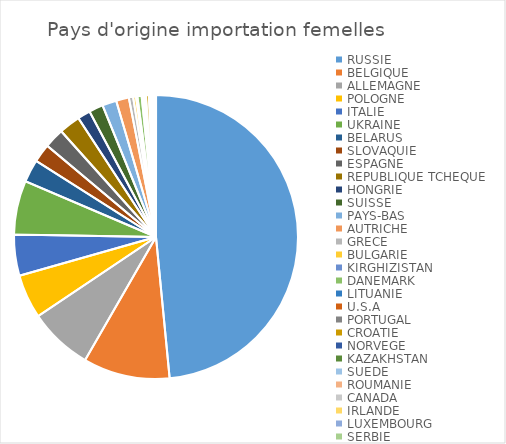
| Category | Series 0 |
|---|---|
| RUSSIE | 300 |
| BELGIQUE | 61 |
| ALLEMAGNE | 45 |
| POLOGNE | 31 |
| ITALIE | 29 |
| UKRAINE | 38 |
| BELARUS | 16 |
| SLOVAQUIE | 13 |
| ESPAGNE | 14 |
| REPUBLIQUE TCHEQUE | 15 |
| HONGRIE | 9 |
| SUISSE | 10 |
| PAYS-BAS | 10 |
| AUTRICHE | 9 |
| GRECE | 3 |
| BULGARIE | 2 |
| KIRGHIZISTAN | 1 |
| DANEMARK | 3 |
| LITUANIE | 1 |
| U.S.A | 1 |
| PORTUGAL | 1 |
| CROATIE | 2 |
| NORVEGE | 1 |
| KAZAKHSTAN | 1 |
| SUEDE | 0 |
| ROUMANIE | 0 |
| CANADA | 1 |
| IRLANDE | 1 |
| LUXEMBOURG | 1 |
| SERBIE | 0 |